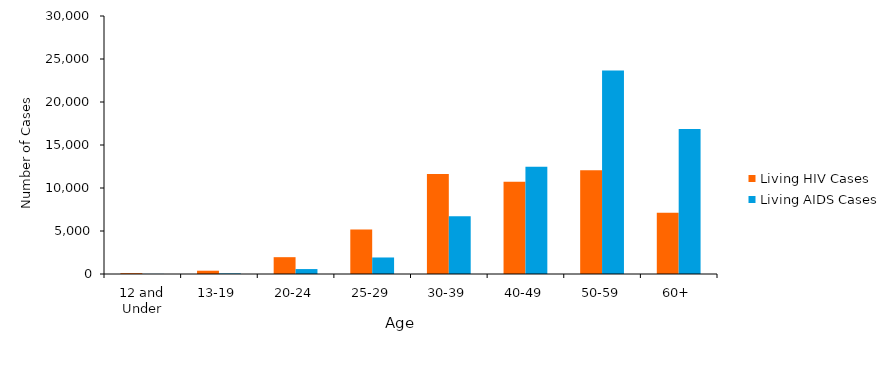
| Category | Living HIV Cases | Living AIDS Cases |
|---|---|---|
| 12 and Under | 97 | 13 |
| 13-19 | 382 | 68 |
| 20-24 | 1956 | 574 |
| 25-29 | 5163 | 1921 |
| 30-39 | 11628 | 6715 |
| 40-49 | 10741 | 12475 |
| 50-59 | 12063 | 23677 |
| 60+ | 7133 | 16848 |